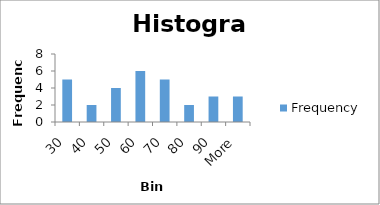
| Category | Frequency |
|---|---|
| 30 | 5 |
| 40 | 2 |
| 50 | 4 |
| 60 | 6 |
| 70 | 5 |
| 80 | 2 |
| 90 | 3 |
| More | 3 |